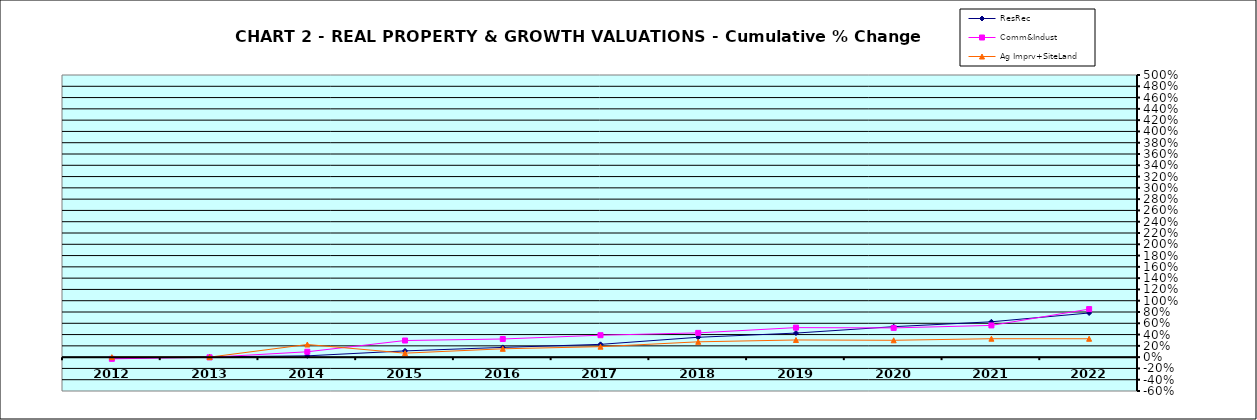
| Category | ResRec | Comm&Indust | Ag Imprv+SiteLand |
|---|---|---|---|
| 2012.0 | -0.016 | -0.03 | 0 |
| 2013.0 | 0.004 | -0.003 | 0 |
| 2014.0 | 0.023 | 0.095 | 0.224 |
| 2015.0 | 0.111 | 0.294 | 0.071 |
| 2016.0 | 0.173 | 0.322 | 0.148 |
| 2017.0 | 0.227 | 0.389 | 0.186 |
| 2018.0 | 0.352 | 0.43 | 0.272 |
| 2019.0 | 0.426 | 0.523 | 0.304 |
| 2020.0 | 0.54 | 0.518 | 0.299 |
| 2021.0 | 0.626 | 0.562 | 0.327 |
| 2022.0 | 0.782 | 0.852 | 0.326 |